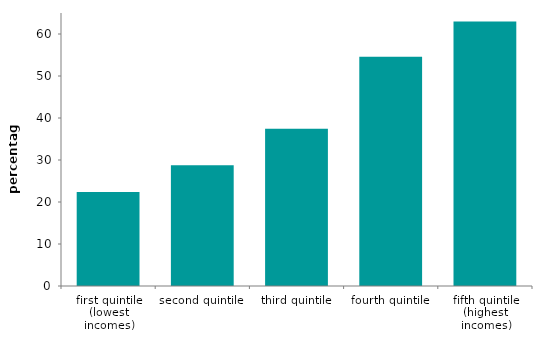
| Category | current arrears |
|---|---|
| first quintile (lowest incomes) | 22.351 |
| second quintile | 28.736 |
| third quintile | 37.464 |
| fourth quintile | 54.588 |
| fifth quintile (highest incomes) | 63.002 |